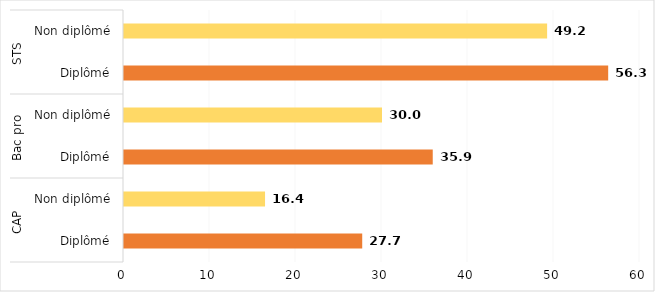
| Category | Series 0 |
|---|---|
| 0 | 27.7 |
| 1 | 16.4 |
| 2 | 35.9 |
| 3 | 30 |
| 4 | 56.3 |
| 5 | 49.2 |